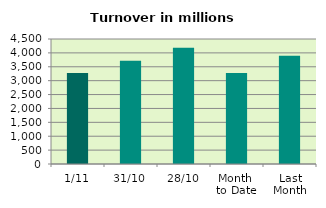
| Category | Series 0 |
|---|---|
| 1/11 | 3274.714 |
| 31/10 | 3718.922 |
| 28/10 | 4183.078 |
| Month 
to Date | 3274.714 |
| Last
Month | 3895.685 |